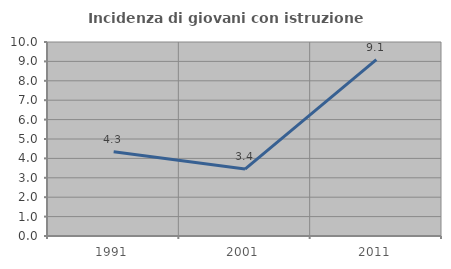
| Category | Incidenza di giovani con istruzione universitaria |
|---|---|
| 1991.0 | 4.348 |
| 2001.0 | 3.448 |
| 2011.0 | 9.091 |